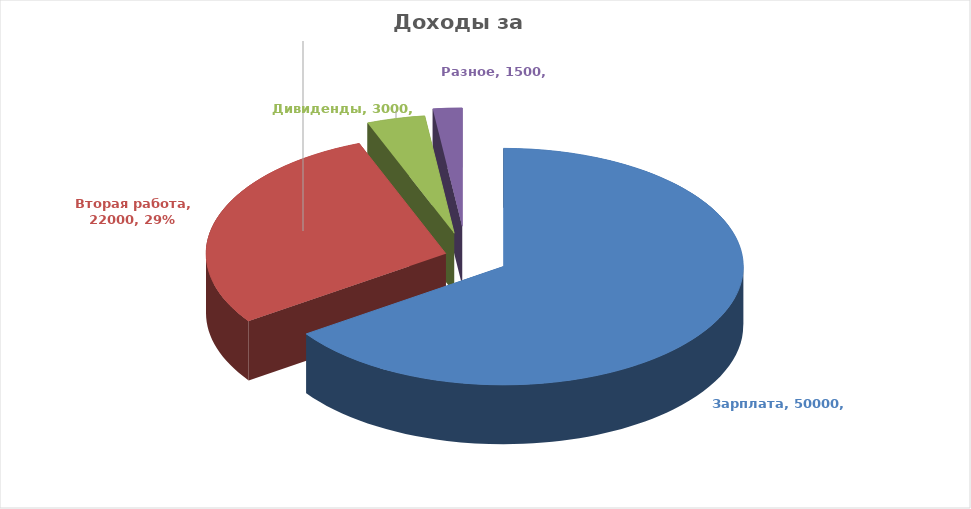
| Category | Series 3 | Series 0 | Series 1 | Series 2 |
|---|---|---|---|---|
| Зарплата | 50000 |  |  | 50000 |
| Вторая работа | 22000 |  |  | 22000 |
| Дивиденды | 3000 |  |  | 3000 |
| Разное | 1500 |  |  | 1500 |